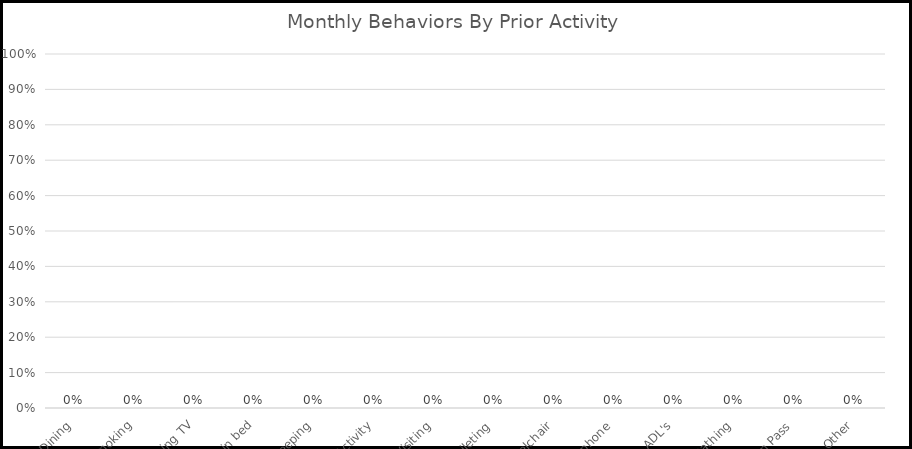
| Category | Monthly Behaviors By Prior Activity |
|---|---|
| Dining | 0 |
| Smoking | 0 |
| Watching TV | 0 |
| Lying in bed | 0 |
| Sleeping | 0 |
| Group Activity | 0 |
| Visiting | 0 |
| Toileting | 0 |
| Wheelchair | 0 |
| Telephone | 0 |
| ADL's | 0 |
| Bathing | 0 |
| Medication Pass | 0 |
| Other | 0 |